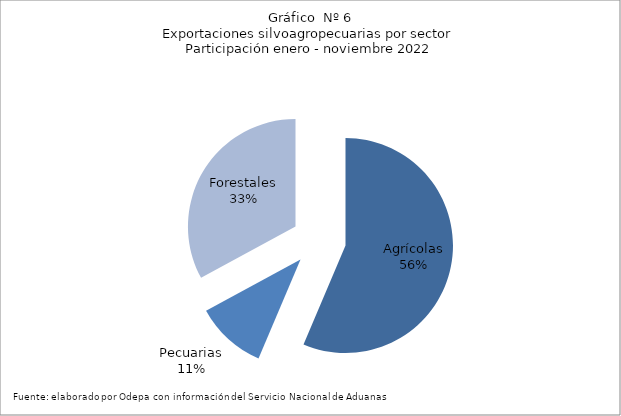
| Category | Series 0 |
|---|---|
| Agrícolas | 9555249 |
| Pecuarias | 1810572 |
| Forestales | 5579918 |